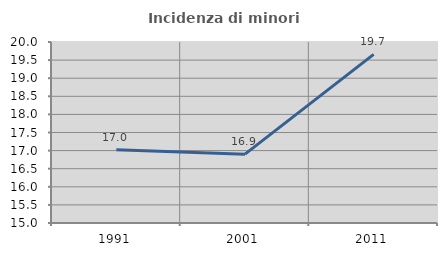
| Category | Incidenza di minori stranieri |
|---|---|
| 1991.0 | 17.021 |
| 2001.0 | 16.901 |
| 2011.0 | 19.658 |